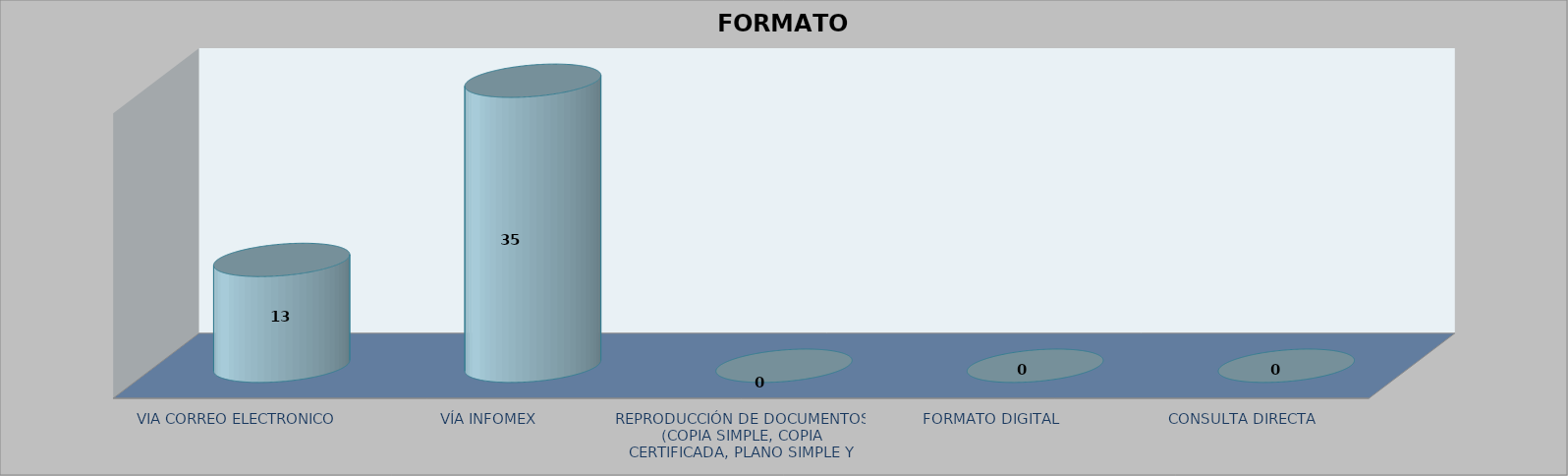
| Category |        FORMATO SOLICITADO | Series 1 | Series 2 |
|---|---|---|---|
| VIA CORREO ELECTRONICO |  |  | 13 |
| VÍA INFOMEX |  |  | 35 |
| REPRODUCCIÓN DE DOCUMENTOS (COPIA SIMPLE, COPIA CERTIFICADA, PLANO SIMPLE Y PLANO CERTIFICADO) |  |  | 0 |
| FORMATO DIGITAL |  |  | 0 |
| CONSULTA DIRECTA |  |  | 0 |